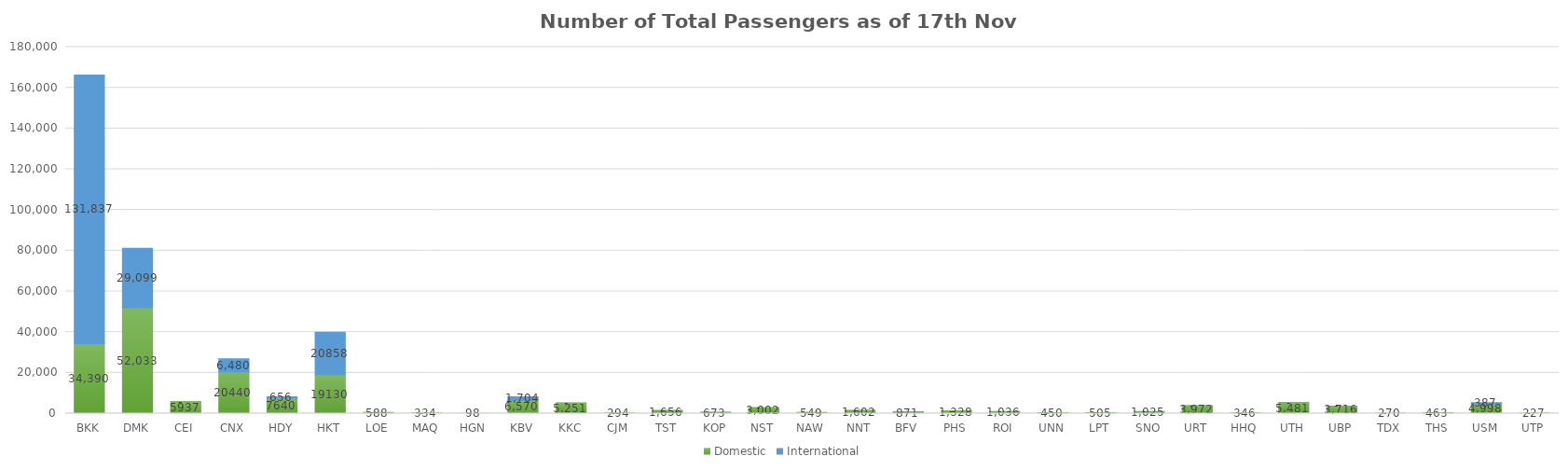
| Category | Domestic | International |
|---|---|---|
| BKK | 34390 | 131837 |
| DMK | 52033 | 29099 |
| CEI | 5937 | 0 |
| CNX | 20440 | 6480 |
| HDY | 7640 | 656 |
| HKT | 19130 | 20858 |
| LOE | 588 | 0 |
| MAQ | 334 | 0 |
| HGN | 98 | 0 |
| KBV | 6570 | 1704 |
| KKC | 5251 | 0 |
| CJM | 294 | 0 |
| TST | 1656 | 0 |
| KOP | 673 | 0 |
| NST | 3002 | 0 |
| NAW | 549 | 0 |
| NNT | 1602 | 0 |
| BFV | 871 | 0 |
| PHS | 1328 | 0 |
| ROI | 1036 | 0 |
| UNN | 450 | 0 |
| LPT | 505 | 0 |
| SNO | 1025 | 0 |
| URT | 3972 | 0 |
| HHQ | 346 | 0 |
| UTH | 5481 | 0 |
| UBP | 3716 | 0 |
| TDX | 270 | 0 |
| THS | 463 | 0 |
| USM | 4998 | 387 |
| UTP | 227 | 0 |